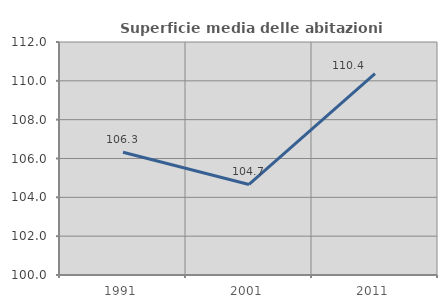
| Category | Superficie media delle abitazioni occupate |
|---|---|
| 1991.0 | 106.321 |
| 2001.0 | 104.663 |
| 2011.0 | 110.371 |